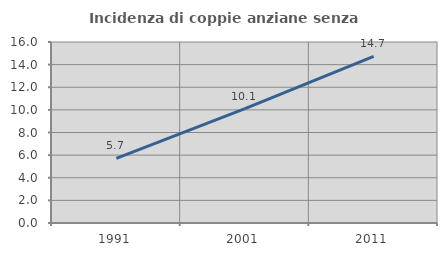
| Category | Incidenza di coppie anziane senza figli  |
|---|---|
| 1991.0 | 5.72 |
| 2001.0 | 10.102 |
| 2011.0 | 14.736 |